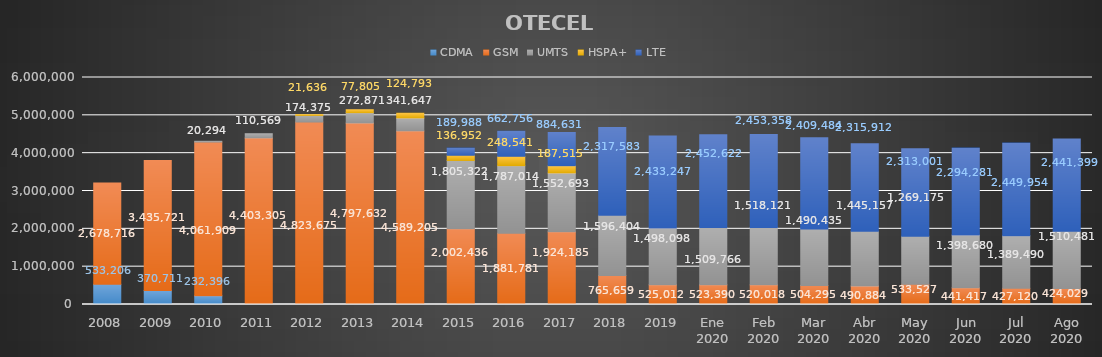
| Category | CDMA | GSM | UMTS | HSPA+ | LTE |
|---|---|---|---|---|---|
| 2008 | 533206 | 2678716 | 0 | 0 | 0 |
| 2009 | 370711 | 3435721 | 0 | 0 | 0 |
| 2010 | 232396 | 4061909 | 20294 | 0 | 0 |
| 2011 | 0 | 4403305 | 110569 | 0 | 0 |
| 2012 | 0 | 4823675 | 174375 | 21636 | 0 |
| 2013 | 0 | 4797632 | 272871 | 77805 | 0 |
| 2014 | 0 | 4589205 | 341647 | 124793 | 0 |
| 2015 | 0 | 2002436 | 1805322 | 136952 | 189988 |
| 2016 | 0 | 1881781 | 1787014 | 248541 | 662756 |
| 2017 | 0 | 1924184.634 | 1552693.066 | 187515.199 | 884631.101 |
| 2018 | 0 | 765658.891 | 1596404.415 | 0 | 2317582.694 |
| 2019 | 0 | 525011.505 | 1498097.705 | 0 | 2433246.79 |
| Ene 2020 | 0 | 523389.568 | 1509766.178 | 0 | 2452622.254 |
| Feb 2020 | 0 | 520017.519 | 1518121.253 | 0 | 2453358.229 |
| Mar 2020 | 0 | 504295.417 | 1490435.081 | 0 | 2409483.502 |
| Abr 2020 | 0 | 490883.546 | 1445156.93 | 0 | 2315911.524 |
| May 2020 | 0 | 533526.941 | 1269174.638 | 0 | 2313001.421 |
| Jun 2020 | 0 | 441417.045 | 1398679.945 | 0 | 2294281.011 |
| Jul 2020 | 0 | 427119.681 | 1389489.558 | 0 | 2449953.761 |
| Ago 2020 | 0 | 424029.106 | 1510481.03 | 0 | 2441398.864 |